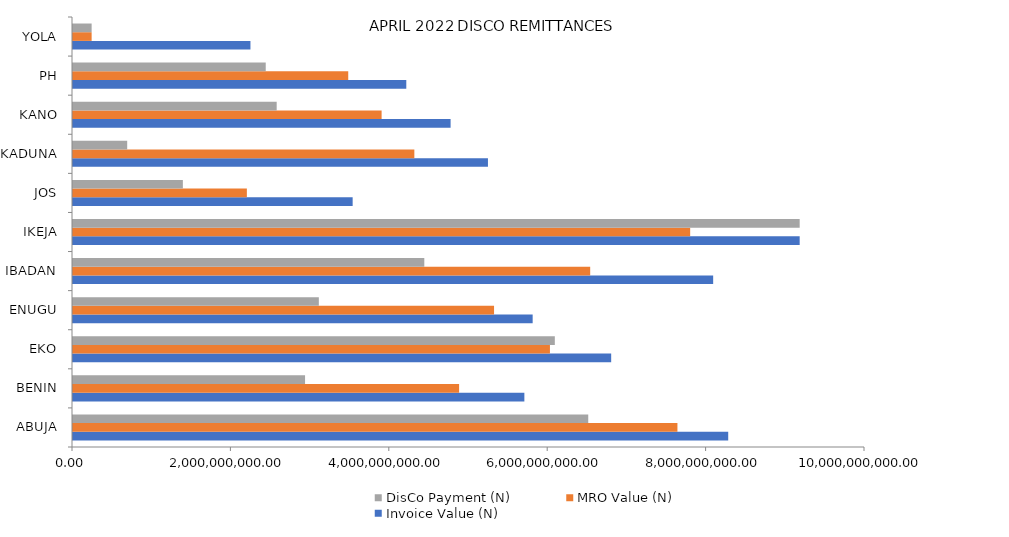
| Category | Invoice Value (N) | MRO Value (N) | DisCo Payment (N) |
|---|---|---|---|
| ABUJA | 8272866736.294 | 7631719564.231 | 6505527609.62 |
| BENIN | 5699127765.551 | 4875033890.652 | 2930014509.74 |
| EKO | 6795235470.27 | 6021937673.753 | 6083622762.66 |
| ENUGU | 5803789256.403 | 5316270958.865 | 3103912079.41 |
| IBADAN | 8082921007.544 | 6530191881.995 | 4435669832.3 |
| IKEJA | 9175270615.063 | 7792557333.373 | 9175270615.06 |
| JOS | 3530965332.123 | 2195201146.981 | 1387223892.67 |
| KADUNA | 5239346709.629 | 4309886603.341 | 684349655.78 |
| KANO | 4767652462.831 | 3896602357.872 | 2571848848.93 |
| PH | 4208267494.615 | 3475187297.053 | 2433473245.51 |
| YOLA | 2240538458.91 | 235256538.186 | 235256538.19 |